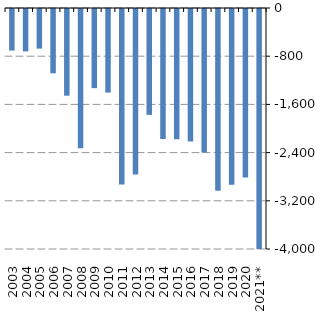
| Category | Series 0 |
|---|---|
| 2003 | -689608.964 |
| 2004 | -703502.349 |
| 2005 | -657023.596 |
| 2006 | -1067585.318 |
| 2007 | -1439075.601 |
| 2008 | -2310470.394 |
| 2009 | -1313701.58 |
| 2010 | -1387122.064 |
| 2011 | -2912119.382 |
| 2012 | -2746813.976 |
| 2013 | -1756780.293 |
| 2014 | -2158803.237 |
| 2015 | -2162583.122 |
| 2016 | -2200852.494 |
| 2017 | -2383813.754 |
| 2018 | -3015484.137 |
| 2019 | -2918244.594 |
| 2020 | -2795628.56 |
| 2021** | -6050843.155 |